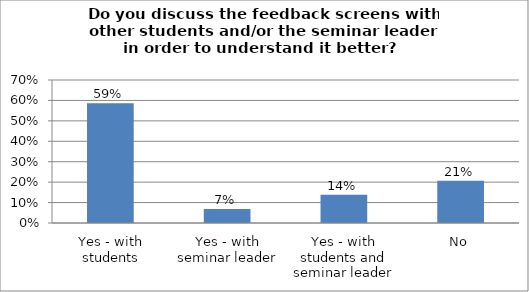
| Category | Series 0 |
|---|---|
| Yes - with students | 0.586 |
| Yes - with seminar leader | 0.069 |
| Yes - with students and seminar leader | 0.138 |
| No | 0.207 |